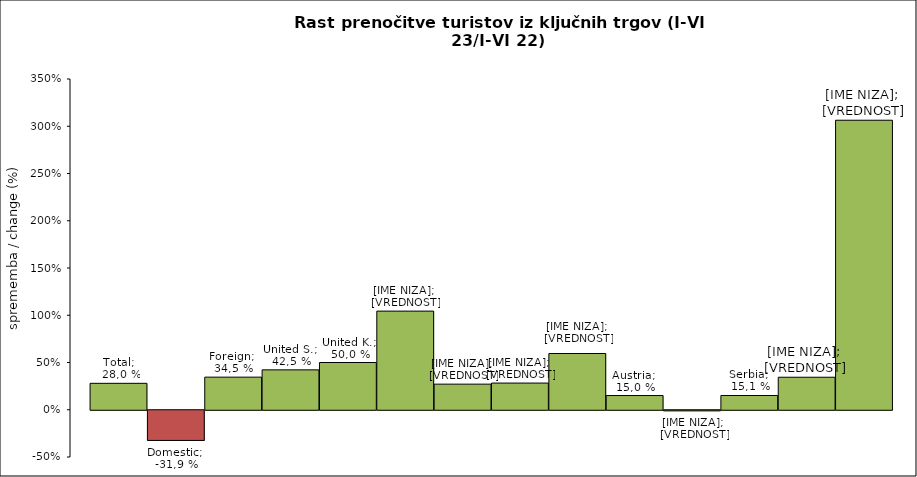
| Category | Total | Domestic | Foreign | United States | United Kingdom | Italy | Germany | France | Spain  | Austria | Hungary | Serbia | Croatia | Benelux |
|---|---|---|---|---|---|---|---|---|---|---|---|---|---|---|
| 0 | 0.28 | -0.319 | 0.345 | 0.422 | 0.5 | 1.044 | 0.271 | 0.282 | 0.595 | 0.15 | -0.006 | 0.151 | 0.344 | 3.064 |